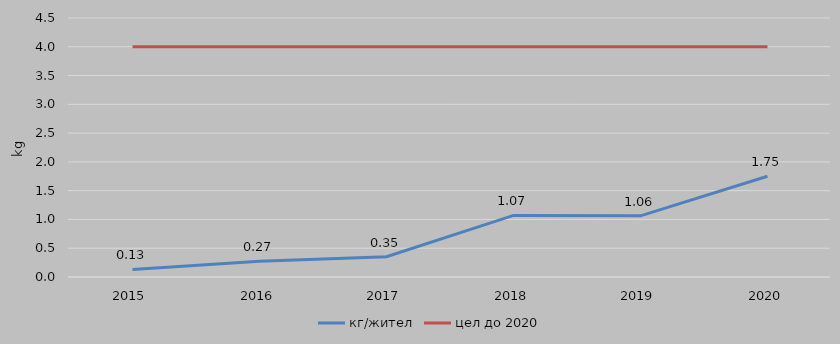
| Category | кг/жител | цел до 2020 |
|---|---|---|
| 2015 | 0.131 | 4 |
| 2016 | 0.273 | 4 |
| 2017 | 0.353 | 4 |
| 2018 | 1.07 | 4 |
| 2019 | 1.063 | 4 |
| 2020 | 1.75 | 4 |